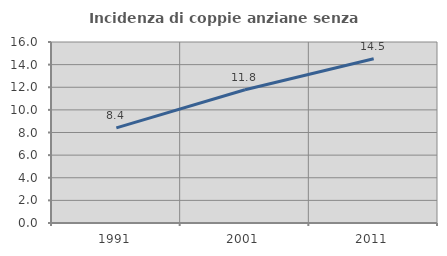
| Category | Incidenza di coppie anziane senza figli  |
|---|---|
| 1991.0 | 8.408 |
| 2001.0 | 11.778 |
| 2011.0 | 14.513 |